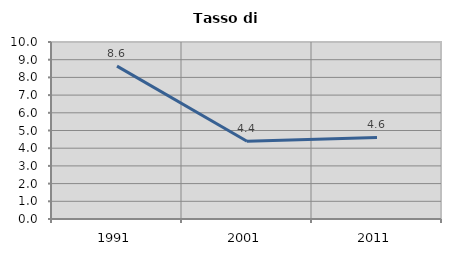
| Category | Tasso di disoccupazione   |
|---|---|
| 1991.0 | 8.639 |
| 2001.0 | 4.396 |
| 2011.0 | 4.611 |